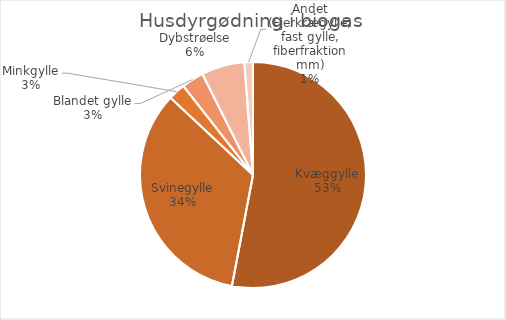
| Category | Series 0 |
|---|---|
| Kvæggylle | 3258045.82 |
| Svinegylle | 2089848.29 |
| Minkgylle | 151208 |
| Blandet gylle | 194753.551 |
| Dybstrøelse | 379626.07 |
| Andet (Fjerkrægylle, fast gylle, fiberfraktion mm) | 75572 |